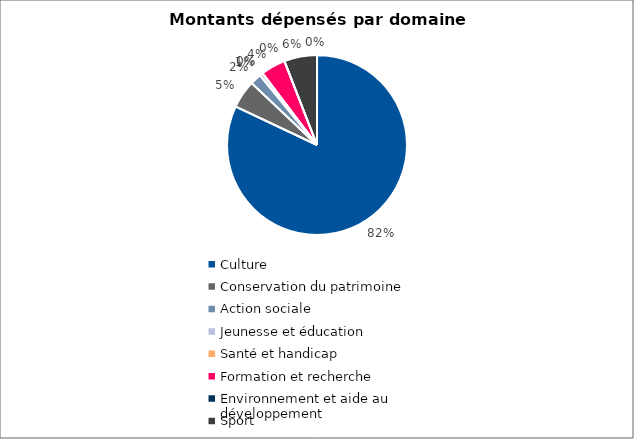
| Category | Series 0 |
|---|---|
| Culture | 407000 |
| Conservation du patrimoine | 25000 |
| Action sociale | 10000 |
| Jeunesse et éducation | 2900 |
| Santé et handicap | 0 |
| Formation et recherche | 22000 |
| Environnement et aide au
développement | 0 |
| Sport | 29284 |
| Autres projets d’utilité publique | 0 |